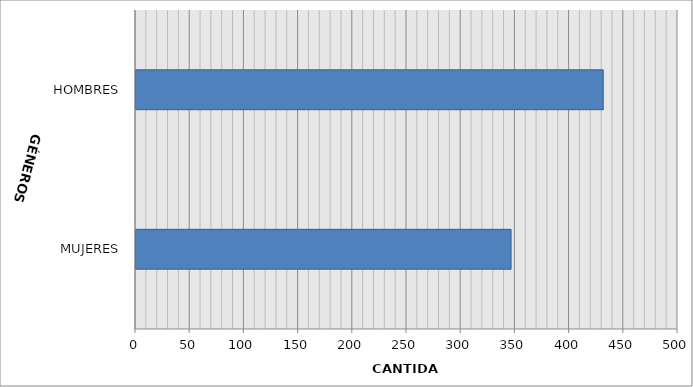
| Category | Series 0 |
|---|---|
| MUJERES | 346 |
| HOMBRES | 431 |